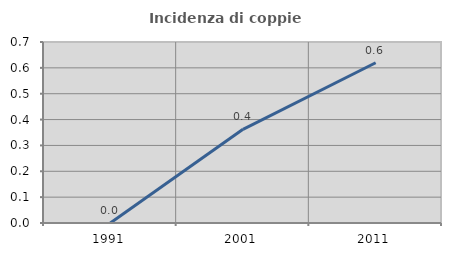
| Category | Incidenza di coppie miste |
|---|---|
| 1991.0 | 0 |
| 2001.0 | 0.362 |
| 2011.0 | 0.62 |